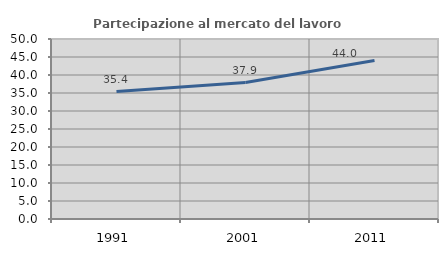
| Category | Partecipazione al mercato del lavoro  femminile |
|---|---|
| 1991.0 | 35.407 |
| 2001.0 | 37.896 |
| 2011.0 | 44.032 |